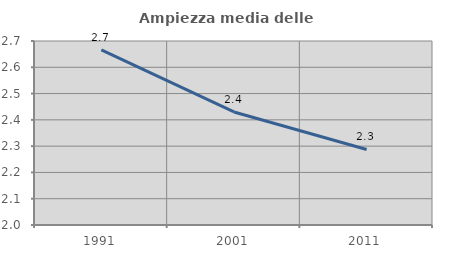
| Category | Ampiezza media delle famiglie |
|---|---|
| 1991.0 | 2.666 |
| 2001.0 | 2.43 |
| 2011.0 | 2.287 |